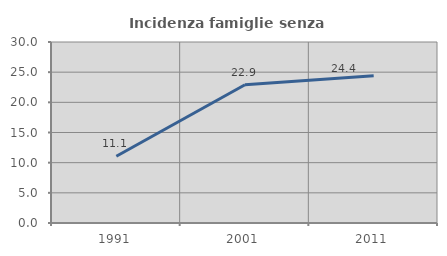
| Category | Incidenza famiglie senza nuclei |
|---|---|
| 1991.0 | 11.072 |
| 2001.0 | 22.906 |
| 2011.0 | 24.419 |